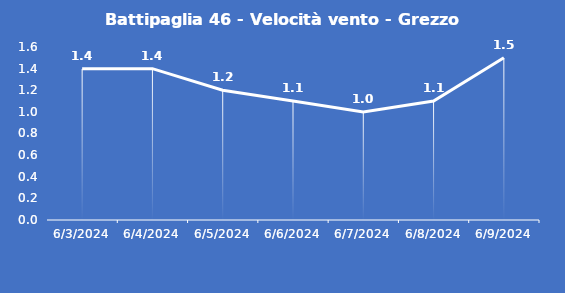
| Category | Battipaglia 46 - Velocità vento - Grezzo (m/s) |
|---|---|
| 6/3/24 | 1.4 |
| 6/4/24 | 1.4 |
| 6/5/24 | 1.2 |
| 6/6/24 | 1.1 |
| 6/7/24 | 1 |
| 6/8/24 | 1.1 |
| 6/9/24 | 1.5 |